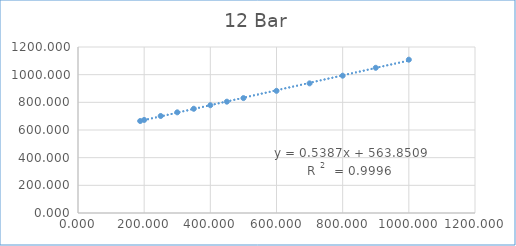
| Category | Series 0 |
|---|---|
| 188.0 | 665.002 |
| 200.0 | 672.742 |
| 250.0 | 701.29 |
| 300.0 | 727.735 |
| 350.0 | 753.512 |
| 400.0 | 779.097 |
| 450.0 | 804.754 |
| 500.0 | 830.602 |
| 600.0 | 883.182 |
| 700.0 | 937.148 |
| 800.0 | 992.642 |
| 900.0 | 1049.689 |
| 1000.0 | 1108.313 |